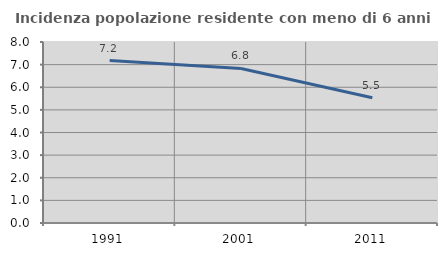
| Category | Incidenza popolazione residente con meno di 6 anni |
|---|---|
| 1991.0 | 7.177 |
| 2001.0 | 6.831 |
| 2011.0 | 5.538 |